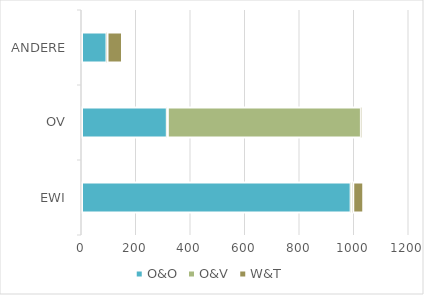
| Category | O&O | O&V | W&T |
|---|---|---|---|
| EWI | 989.563 | 5.5 | 40.723 |
| OV | 314.96 | 712.243 | 3.069 |
| ANDERE | 93.712 | 0.143 | 57.048 |